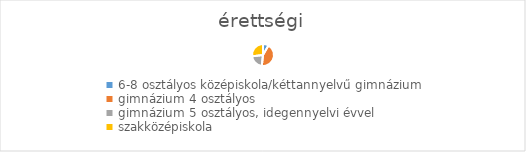
| Category | Series 0 |
|---|---|
| 6-8 osztályos középiskola/kéttannyelvű gimnázium | 40 |
| gimnázium 4 osztályos | 210 |
| gimnázium 5 osztályos, idegennyelvi évvel | 103 |
| szakközépiskola | 130 |